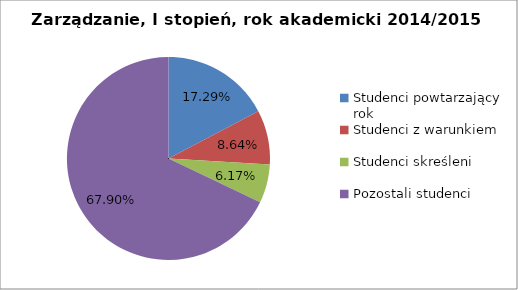
| Category | Series 0 |
|---|---|
| Studenci powtarzający rok | 14 |
| Studenci z warunkiem | 7 |
| Studenci skreśleni | 5 |
| Pozostali studenci | 55 |